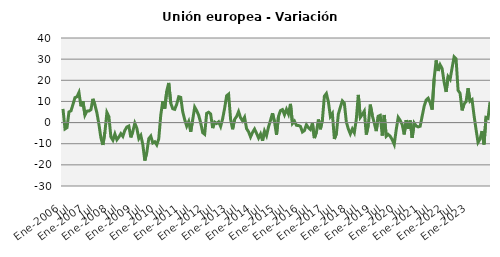
| Category | Series 0 |
|---|---|
| Ene-2006 | 6.468 |
|  | -3.034 |
|  | -2.406 |
|  | 5.056 |
|  | 5.525 |
|  | 8.584 |
| Jul | 11.801 |
|  | 12.223 |
|  | 14.247 |
|  | 7.669 |
|  | 10.099 |
|  | 3.548 |
| Ene-2007 | 5.413 |
|  | 5.491 |
|  | 6.123 |
|  | 11.215 |
|  | 8.374 |
|  | 4.574 |
| Jul | -0.811 |
|  | -7.248 |
|  | -10.577 |
|  | -4.578 |
|  | 4.782 |
|  | 2.845 |
| Ene-2008 | -6.812 |
|  | -8.332 |
|  | -5.395 |
|  | -8.13 |
|  | -6.872 |
|  | -5.245 |
| Jul | -6.527 |
|  | -3.72 |
|  | -2.077 |
|  | -1.62 |
|  | -7.022 |
|  | -4.169 |
| Ene-2009 | -0.296 |
|  | -2.659 |
|  | -7.57 |
|  | -6.063 |
|  | -10.399 |
|  | -17.96 |
| Jul | -14.08 |
|  | -7.569 |
|  | -6.393 |
|  | -9.641 |
|  | -9.067 |
|  | -10.542 |
| Ene-2010 | -7.628 |
|  | 3.544 |
|  | 10.067 |
|  | 6.588 |
|  | 14.898 |
|  | 18.75 |
| Jul | 9.182 |
|  | 6.552 |
|  | 6.264 |
|  | 8.699 |
|  | 12.215 |
|  | 11.921 |
| Ene-2011 | 5.098 |
|  | 1.386 |
|  | -1.679 |
|  | 0.481 |
|  | -4.373 |
|  | 1.312 |
| Jul | 7.307 |
|  | 5.64 |
|  | 3.448 |
|  | -0.074 |
|  | -4.771 |
|  | -5.532 |
| Ene-2012 | 4.375 |
|  | 4.882 |
|  | 4.063 |
|  | -2.615 |
|  | 0.223 |
|  | -0.42 |
| Jul | 0.368 |
|  | -1.828 |
|  | 1.772 |
|  | 6.747 |
|  | 12.669 |
|  | 13.45 |
| Ene-2013 | 1.562 |
|  | -3.152 |
|  | 1.506 |
|  | 2.869 |
|  | 5.189 |
|  | 2.248 |
| Jul | 0.802 |
|  | 2.521 |
|  | -2.877 |
|  | -4.344 |
|  | -6.808 |
|  | -4.643 |
| Ene-2014 | -3.061 |
|  | -5.103 |
|  | -7.31 |
|  | -5.43 |
|  | -8.588 |
|  | -4.01 |
| Jul | -6.161 |
|  | -2.044 |
|  | 1.088 |
|  | 4.434 |
|  | 0.384 |
|  | -5.784 |
| Ene-2015 | 2.936 |
|  | 5.671 |
|  | 6.128 |
|  | 3.694 |
|  | 6.265 |
|  | 4.011 |
| Jul | 8.836 |
|  | -0.455 |
|  | 0.674 |
|  | -1.315 |
|  | -1.375 |
|  | -1.812 |
| Ene-2016 | -4.449 |
|  | -3.796 |
|  | -1.01 |
|  | -2.426 |
|  | -3.304 |
|  | -0.262 |
| Jul | -7.325 |
|  | -4.594 |
|  | 1.447 |
|  | -3.15 |
|  | 1.222 |
|  | 12.486 |
| Ene-2017 | 13.751 |
|  | 9.842 |
|  | 2.899 |
|  | 4.299 |
|  | -7.765 |
|  | -5.307 |
| Jul | 3.998 |
|  | 7.279 |
|  | 10.26 |
|  | 9.193 |
|  | 0.28 |
|  | -3.023 |
| Ene-2018 | -5.36 |
|  | -3.03 |
|  | -4.795 |
|  | 1.571 |
|  | 13.091 |
|  | 2.478 |
| Jul | 3.833 |
|  | 5.402 |
|  | -5.686 |
|  | -1.248 |
|  | 8.496 |
|  | 3.335 |
| Ene-2019 | -0.193 |
|  | -4.034 |
|  | 3 |
|  | 3.43 |
|  | -6.156 |
|  | 3.598 |
| Jul | -6.479 |
|  | -5.601 |
|  | -6.495 |
|  | -8.116 |
|  | -10.323 |
|  | -3.354 |
| Ene-2020 | 2.462 |
|  | 1.024 |
|  | -0.892 |
|  | -5.607 |
|  | 1.156 |
|  | -2.964 |
| Jul | 0.981 |
|  | -7.222 |
|  | -0.225 |
|  | -1.611 |
|  | -2.035 |
|  | -1.725 |
| Ene-2021 | 3.067 |
|  | 7.715 |
|  | 10.657 |
|  | 11.519 |
|  | 9.354 |
|  | 6.156 |
| Jul | 20.814 |
|  | 29.401 |
|  | 24.409 |
|  | 27.343 |
|  | 25.531 |
|  | 19.178 |
| Ene-2022 | 14.49 |
|  | 21.737 |
|  | 20.409 |
|  | 25.848 |
|  | 31.062 |
|  | 30.106 |
| Jul | 15.245 |
|  | 13.864 |
|  | 5.773 |
|  | 8.824 |
|  | 9.896 |
|  | 16.246 |
| Ene-2023 | 10.109 |